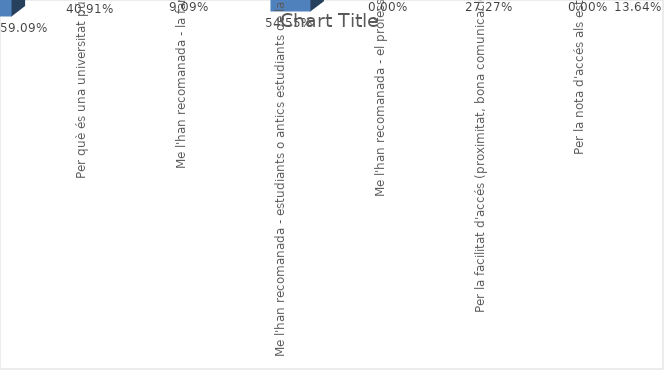
| Category | Series 0 |
|---|---|
| Crec que és la única que ofereix aquests estudis | 0.591 |
| Per què és una universitat pública | 0.409 |
| Me l'han recomanada - la família | 0.091 |
| Me l'han recomanada - estudiants o antics estudiants de la UPC | 0.545 |
| Me l'han recomanada - el professorat | 0 |
| Per la facilitat d'accés (proximitat, bona comunicació ...) | 0.273 |
| Per la nota d'accés als estudis | 0 |
| Altres | 0.136 |